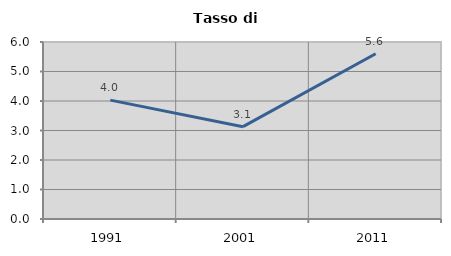
| Category | Tasso di disoccupazione   |
|---|---|
| 1991.0 | 4.029 |
| 2001.0 | 3.129 |
| 2011.0 | 5.602 |